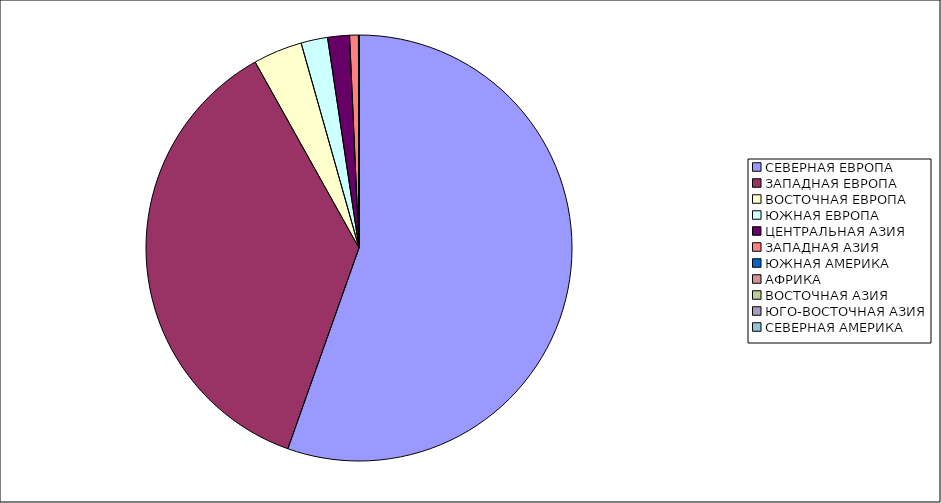
| Category | Оборот |
|---|---|
| СЕВЕРНАЯ ЕВРОПА | 55.422 |
| ЗАПАДНАЯ ЕВРОПА | 36.472 |
| ВОСТОЧНАЯ ЕВРОПА | 3.725 |
| ЮЖНАЯ ЕВРОПА | 2.018 |
| ЦЕНТРАЛЬНАЯ АЗИЯ | 1.659 |
| ЗАПАДНАЯ АЗИЯ | 0.662 |
| ЮЖНАЯ АМЕРИКА | 0.023 |
| АФРИКА | 0.013 |
| ВОСТОЧНАЯ АЗИЯ | 0.007 |
| ЮГО-ВОСТОЧНАЯ АЗИЯ | 0 |
| СЕВЕРНАЯ АМЕРИКА | 0 |